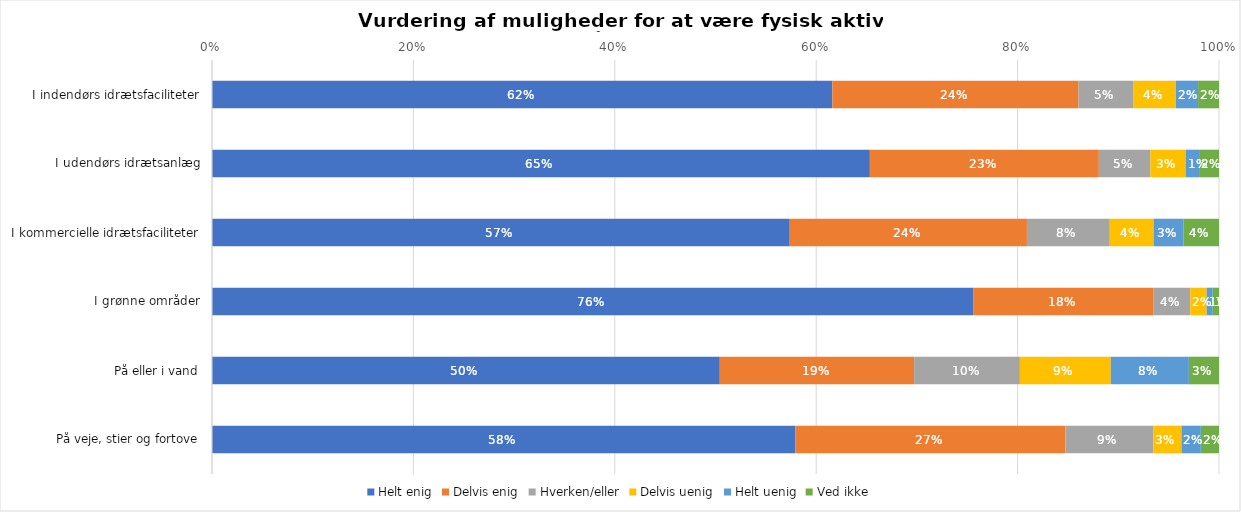
| Category | Helt enig | Delvis enig | Hverken/eller | Delvis uenig | Helt uenig | Ved ikke |
|---|---|---|---|---|---|---|
| I indendørs idrætsfaciliteter | 0.616 | 0.244 | 0.055 | 0.042 | 0.022 | 0.021 |
| I udendørs idrætsanlæg | 0.653 | 0.227 | 0.051 | 0.035 | 0.013 | 0.02 |
| I kommercielle idrætsfaciliteter | 0.574 | 0.236 | 0.082 | 0.043 | 0.03 | 0.035 |
| I grønne områder | 0.756 | 0.178 | 0.037 | 0.016 | 0.006 | 0.006 |
| På eller i vand | 0.504 | 0.193 | 0.105 | 0.09 | 0.078 | 0.03 |
| På veje, stier og fortove | 0.579 | 0.268 | 0.087 | 0.028 | 0.019 | 0.018 |